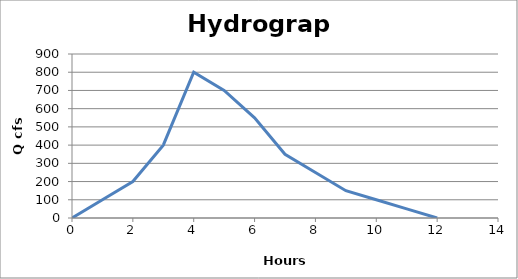
| Category | Series 0 |
|---|---|
| 0.0 | 0 |
| 1.0 | 100 |
| 2.0 | 200 |
| 3.0 | 400 |
| 4.0 | 800 |
| 5.0 | 700 |
| 6.0 | 550 |
| 7.0 | 350 |
| 8.0 | 250 |
| 9.0 | 150 |
| 10.0 | 100 |
| 11.0 | 50 |
| 12.0 | 0 |